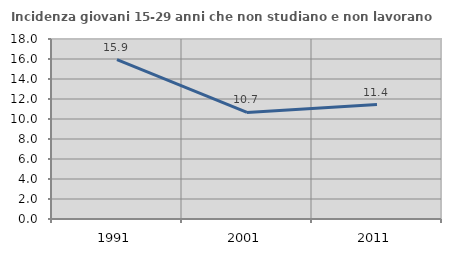
| Category | Incidenza giovani 15-29 anni che non studiano e non lavorano  |
|---|---|
| 1991.0 | 15.934 |
| 2001.0 | 10.657 |
| 2011.0 | 11.447 |